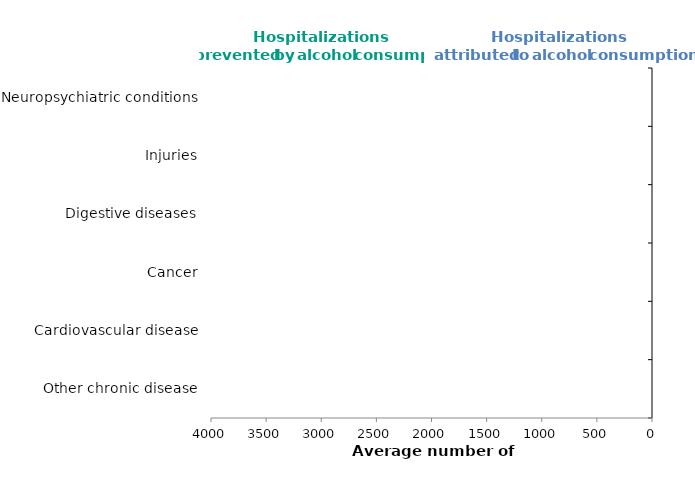
| Category | Detrimental** | Protective |
|---|---|---|
| Other chronic disease | 0 | 0 |
| Cardiovascular disease | 0 | 0 |
| Cancer | 0 | 0 |
| Digestive diseases | 0 | 0 |
| Injuries | 0 | 0 |
| Neuropsychiatric conditions | 0 | 0 |